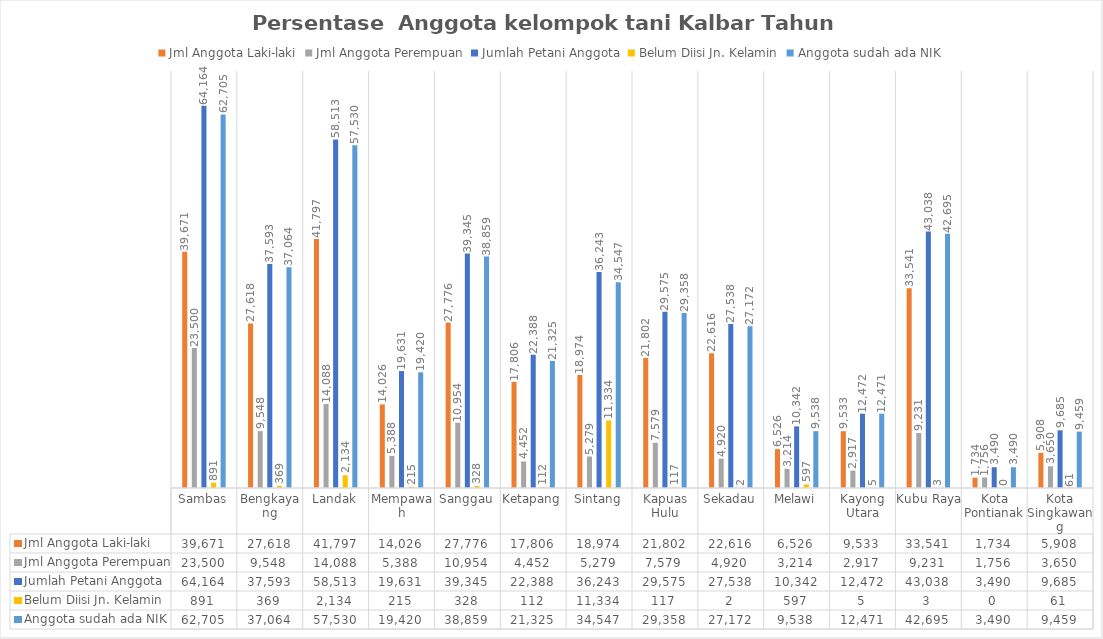
| Category | Jml Anggota Laki-laki | Jml Anggota Perempuan | Jumlah Petani Anggota | Belum Diisi Jn. Kelamin | Anggota sudah ada NIK |
|---|---|---|---|---|---|
| Sambas | 39671 | 23500 | 64164 | 891 | 62705 |
| Bengkayang | 27618 | 9548 | 37593 | 369 | 37064 |
| Landak | 41797 | 14088 | 58513 | 2134 | 57530 |
| Mempawah | 14026 | 5388 | 19631 | 215 | 19420 |
| Sanggau | 27776 | 10954 | 39345 | 328 | 38859 |
| Ketapang | 17806 | 4452 | 22388 | 112 | 21325 |
| Sintang | 18974 | 5279 | 36243 | 11334 | 34547 |
| Kapuas Hulu | 21802 | 7579 | 29575 | 117 | 29358 |
| Sekadau | 22616 | 4920 | 27538 | 2 | 27172 |
| Melawi | 6526 | 3214 | 10342 | 597 | 9538 |
| Kayong Utara | 9533 | 2917 | 12472 | 5 | 12471 |
| Kubu Raya | 33541 | 9231 | 43038 | 3 | 42695 |
| Kota Pontianak | 1734 | 1756 | 3490 | 0 | 3490 |
| Kota Singkawang | 5908 | 3650 | 9685 | 61 | 9459 |